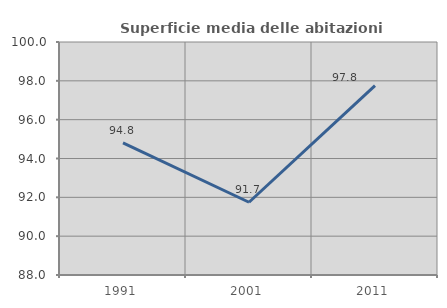
| Category | Superficie media delle abitazioni occupate |
|---|---|
| 1991.0 | 94.807 |
| 2001.0 | 91.746 |
| 2011.0 | 97.757 |